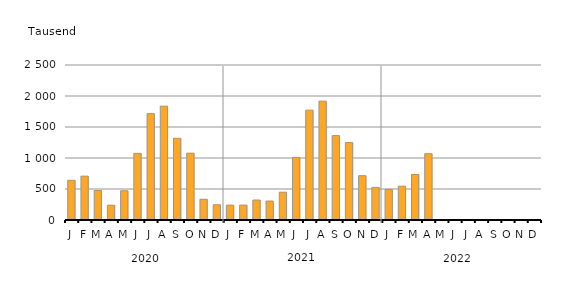
| Category | Insgesamt |
|---|---|
| J | 640266 |
| F | 707371 |
| M | 475797 |
| A | 238298 |
| M | 471802 |
| J | 1074666 |
| J | 1714613 |
| A | 1836120 |
| S | 1317956 |
| O | 1077975 |
| N | 334422 |
| D | 245810 |
| J | 240006 |
| F | 240527 |
| M | 322118 |
| A | 305753 |
| M | 448436 |
| J | 1009640 |
| J | 1771961 |
| A | 1916987 |
| S | 1361271 |
| O | 1248689 |
| N | 714833 |
| D | 526291 |
| J | 492478 |
| F | 545219 |
| M | 734543 |
| A | 1068584 |
| M | 0 |
| J | 0 |
| J | 0 |
| A | 0 |
| S | 0 |
| O | 0 |
| N | 0 |
| D | 0 |